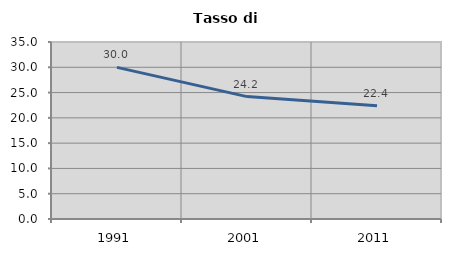
| Category | Tasso di disoccupazione   |
|---|---|
| 1991.0 | 29.98 |
| 2001.0 | 24.2 |
| 2011.0 | 22.392 |